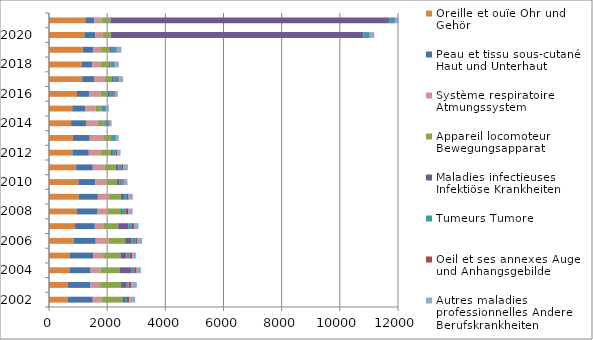
| Category | Oreille et ouïe | Peau et tissu sous-cutané | Système respiratoire | Appareil locomoteur | Maladies infectieuses | Tumeurs | Oeil et ses annexes | Autres maladies professionnelles |
|---|---|---|---|---|---|---|---|---|
| 2002.0 | 638 | 868 | 310 | 730 | 68 | 69 | 73 | 207 |
| 2003.0 | 641 | 787 | 331 | 716 | 195 | 69 | 87 | 193 |
| 2004.0 | 699 | 731 | 342 | 667 | 404 | 89 | 81 | 148 |
| 2005.0 | 702 | 814 | 343 | 600 | 209 | 100 | 103 | 127 |
| 2006.0 | 853 | 753 | 453 | 562 | 219 | 129 | 74 | 162 |
| 2007.0 | 896 | 680 | 315 | 489 | 340 | 116 | 85 | 156 |
| 2008.0 | 949 | 722 | 351 | 453 | 40 | 124 | 95 | 143 |
| 2009.0 | 1021 | 660 | 376 | 413 | 106 | 107 | 54 | 146 |
| 2010.0 | 1008 | 588 | 372 | 372 | 71 | 117 | 45 | 126 |
| 2011.0 | 935 | 571 | 412 | 368 | 98 | 120 | 51 | 155 |
| 2012.0 | 804 | 565 | 414 | 339 | 44 | 129 | 57 | 109 |
| 2013.0 | 820 | 581 | 460 | 270 | 27 | 127 | 23 | 92 |
| 2014.0 | 760 | 511 | 405 | 206 | 30 | 126 | 47 | 67 |
| 2015.0 | 800 | 440 | 359 | 182 | 25 | 140 | 30 | 86 |
| 2016.0 | 963 | 428 | 385 | 240 | 48 | 176 | 27 | 100 |
| 2017.0 | 1142 | 425 | 361 | 239 | 49 | 173 | 26 | 132 |
| 2018.0 | 1125 | 363 | 294 | 285 | 45 | 146 | 28 | 117 |
| 2019.0 | 1160 | 369 | 263 | 297 | 42 | 196 | 26 | 137 |
| 2020.0 | 1214 | 373 | 268 | 267 | 8694 | 186 | 23 | 156 |
| 2021.0 | 1252 | 305 | 261 | 293 | 9586 | 194 | 24 | 114 |